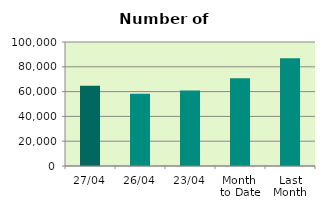
| Category | Series 0 |
|---|---|
| 27/04 | 64652 |
| 26/04 | 58286 |
| 23/04 | 60982 |
| Month 
to Date | 70703.059 |
| Last
Month | 86968.783 |